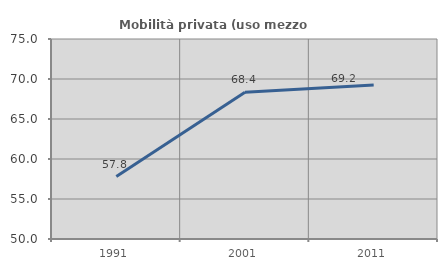
| Category | Mobilità privata (uso mezzo privato) |
|---|---|
| 1991.0 | 57.806 |
| 2001.0 | 68.351 |
| 2011.0 | 69.25 |